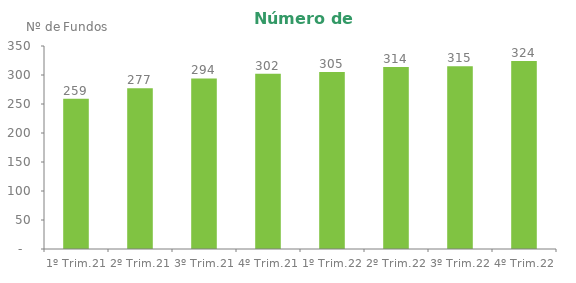
| Category | Series 0 |
|---|---|
| 1º Trim.21 | 259 |
| 2º Trim.21 | 277 |
| 3º Trim.21 | 294 |
| 4º Trim.21 | 302 |
| 1º Trim.22 | 305 |
| 2º Trim.22 | 314 |
| 3º Trim.22 | 315 |
| 4º Trim.22 | 324 |